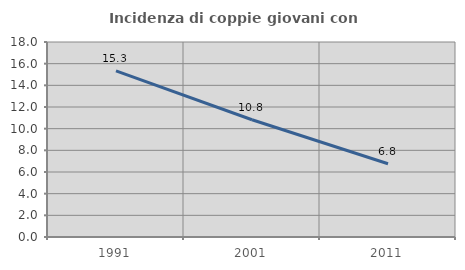
| Category | Incidenza di coppie giovani con figli |
|---|---|
| 1991.0 | 15.337 |
| 2001.0 | 10.821 |
| 2011.0 | 6.763 |